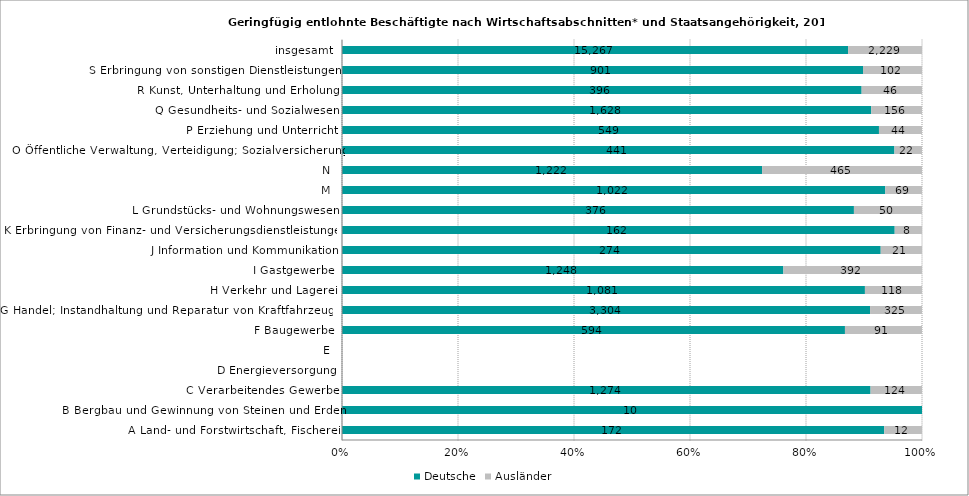
| Category | Deutsche | Ausländer |
|---|---|---|
| A Land- und Forstwirtschaft, Fischerei | 172 | 12 |
| B Bergbau und Gewinnung von Steinen und Erden | 10 | 0 |
| C Verarbeitendes Gewerbe | 1274 | 124 |
| D Energieversorgung | 0 | 0 |
| E | 0 | 0 |
| F Baugewerbe | 594 | 91 |
| G Handel; Instandhaltung und Reparatur von Kraftfahrzeugen | 3304 | 325 |
| H Verkehr und Lagerei | 1081 | 118 |
| I Gastgewerbe | 1248 | 392 |
| J Information und Kommunikation | 274 | 21 |
| K Erbringung von Finanz- und Versicherungsdienstleistungen | 162 | 8 |
| L Grundstücks- und Wohnungswesen | 376 | 50 |
| M | 1022 | 69 |
| N | 1222 | 465 |
| O Öffentliche Verwaltung, Verteidigung; Sozialversicherung | 441 | 22 |
| P Erziehung und Unterricht | 549 | 44 |
| Q Gesundheits- und Sozialwesen | 1628 | 156 |
| R Kunst, Unterhaltung und Erholung | 396 | 46 |
| S Erbringung von sonstigen Dienstleistungen | 901 | 102 |
| insgesamt | 15267 | 2229 |